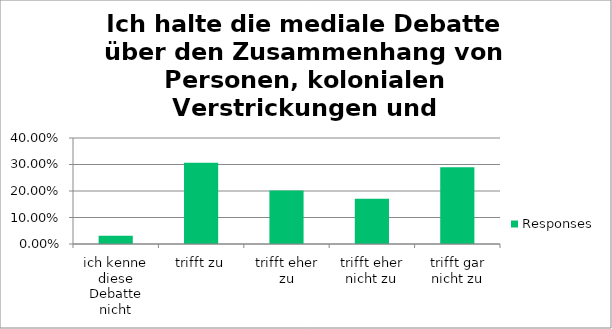
| Category | Responses |
|---|---|
| ich kenne diese Debatte nicht | 0.031 |
| trifft zu | 0.307 |
| trifft eher zu | 0.202 |
| trifft eher nicht zu | 0.171 |
| trifft gar nicht zu | 0.29 |